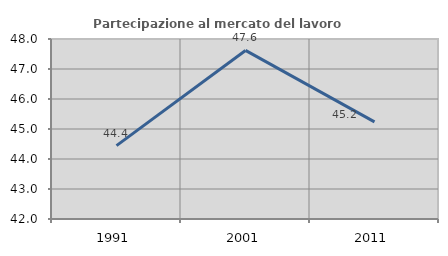
| Category | Partecipazione al mercato del lavoro  femminile |
|---|---|
| 1991.0 | 44.444 |
| 2001.0 | 47.619 |
| 2011.0 | 45.238 |